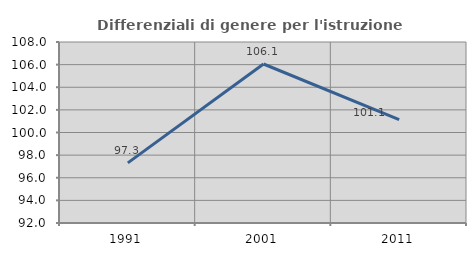
| Category | Differenziali di genere per l'istruzione superiore |
|---|---|
| 1991.0 | 97.312 |
| 2001.0 | 106.055 |
| 2011.0 | 101.137 |